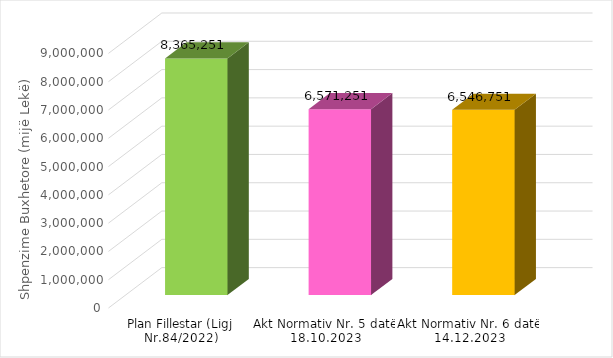
| Category | Shërbimet e Kujdesit Parësor |
|---|---|
| Plan Fillestar (Ligj Nr.84/2022) | 8365251 |
| Akt Normativ Nr. 5 datë 18.10.2023 | 6571251 |
| Akt Normativ Nr. 6 datë 14.12.2023 | 6546751 |